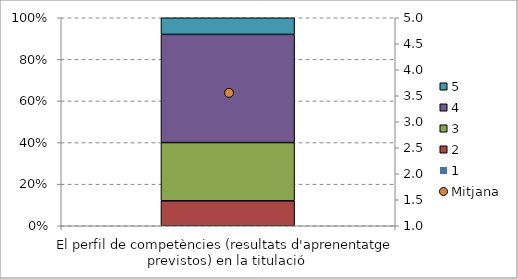
| Category | 1 | 2 | 3 | 4 | 5 |
|---|---|---|---|---|---|
| El perfil de competències (resultats d'aprenentatge previstos) en la titulació | 0 | 0.12 | 0.28 | 0.52 | 0.08 |